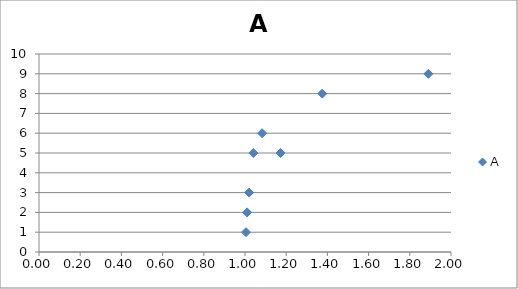
| Category | A |
|---|---|
| 1.004987562112089 | 1 |
| 1.01 | 2 |
| 1.0201 | 3 |
| 1.04060401 | 5 |
| 1.0828567056280802 | 6 |
| 1.1725786449236988 | 5 |
| 1.3749406785310976 | 8 |
| 1.890461869479555 | 9 |